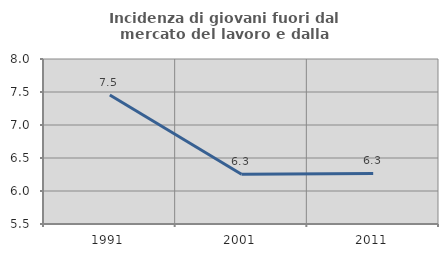
| Category | Incidenza di giovani fuori dal mercato del lavoro e dalla formazione  |
|---|---|
| 1991.0 | 7.456 |
| 2001.0 | 6.255 |
| 2011.0 | 6.266 |